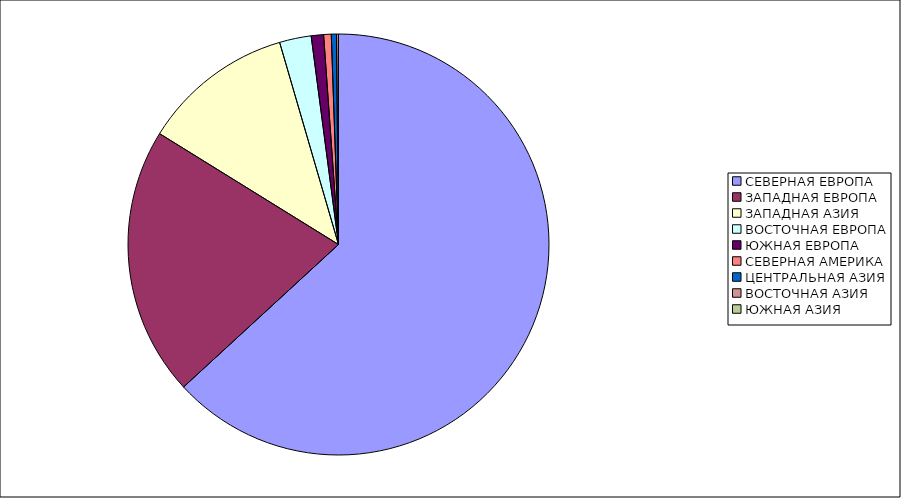
| Category | Оборот |
|---|---|
| СЕВЕРНАЯ ЕВРОПА | 63.163 |
| ЗАПАДНАЯ ЕВРОПА | 20.665 |
| ЗАПАДНАЯ АЗИЯ | 11.661 |
| ВОСТОЧНАЯ ЕВРОПА | 2.434 |
| ЮЖНАЯ ЕВРОПА | 0.947 |
| СЕВЕРНАЯ АМЕРИКА | 0.582 |
| ЦЕНТРАЛЬНАЯ АЗИЯ | 0.396 |
| ВОСТОЧНАЯ АЗИЯ | 0.151 |
| ЮЖНАЯ АЗИЯ | 0 |